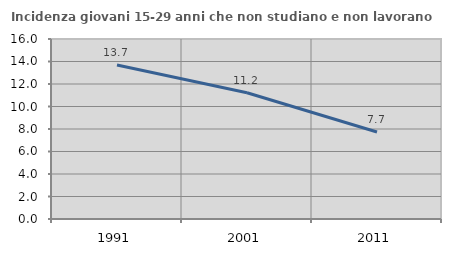
| Category | Incidenza giovani 15-29 anni che non studiano e non lavorano  |
|---|---|
| 1991.0 | 13.697 |
| 2001.0 | 11.224 |
| 2011.0 | 7.732 |